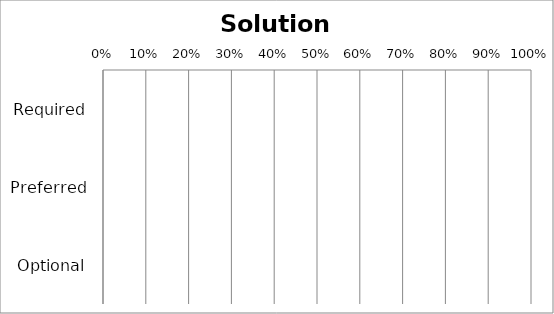
| Category | Series 0 |
|---|---|
| Required | 0 |
| Preferred | 0 |
| Optional | 0 |